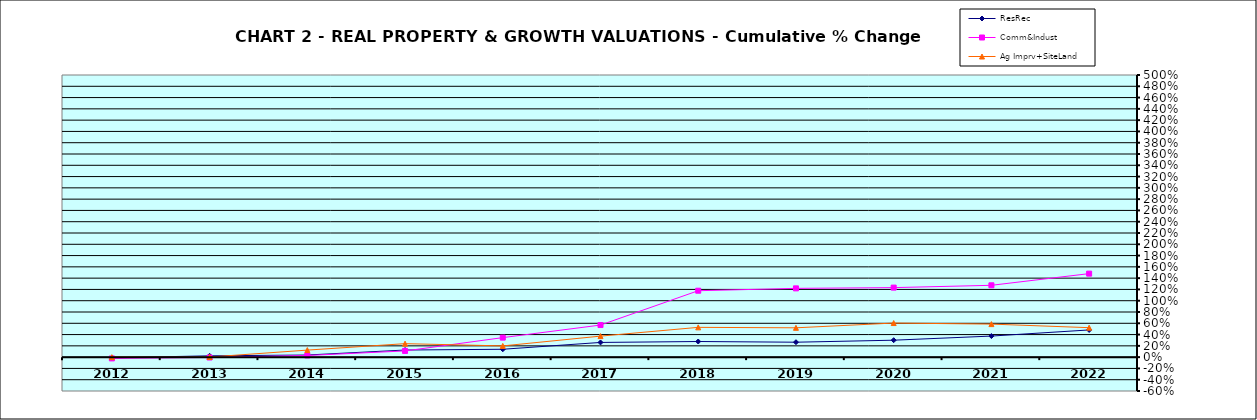
| Category | ResRec | Comm&Indust | Ag Imprv+SiteLand |
|---|---|---|---|
| 2012.0 | -0.012 | -0.022 | 0 |
| 2013.0 | 0.024 | -0.006 | 0.002 |
| 2014.0 | 0.038 | 0.029 | 0.125 |
| 2015.0 | 0.126 | 0.11 | 0.239 |
| 2016.0 | 0.14 | 0.346 | 0.199 |
| 2017.0 | 0.26 | 0.569 | 0.373 |
| 2018.0 | 0.277 | 1.177 | 0.528 |
| 2019.0 | 0.265 | 1.219 | 0.52 |
| 2020.0 | 0.3 | 1.232 | 0.604 |
| 2021.0 | 0.373 | 1.273 | 0.586 |
| 2022.0 | 0.482 | 1.48 | 0.522 |